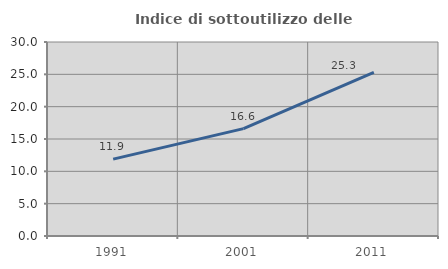
| Category | Indice di sottoutilizzo delle abitazioni  |
|---|---|
| 1991.0 | 11.888 |
| 2001.0 | 16.608 |
| 2011.0 | 25.294 |